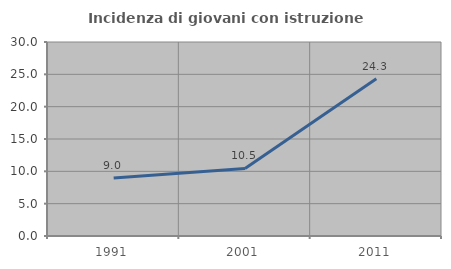
| Category | Incidenza di giovani con istruzione universitaria |
|---|---|
| 1991.0 | 8.962 |
| 2001.0 | 10.455 |
| 2011.0 | 24.324 |